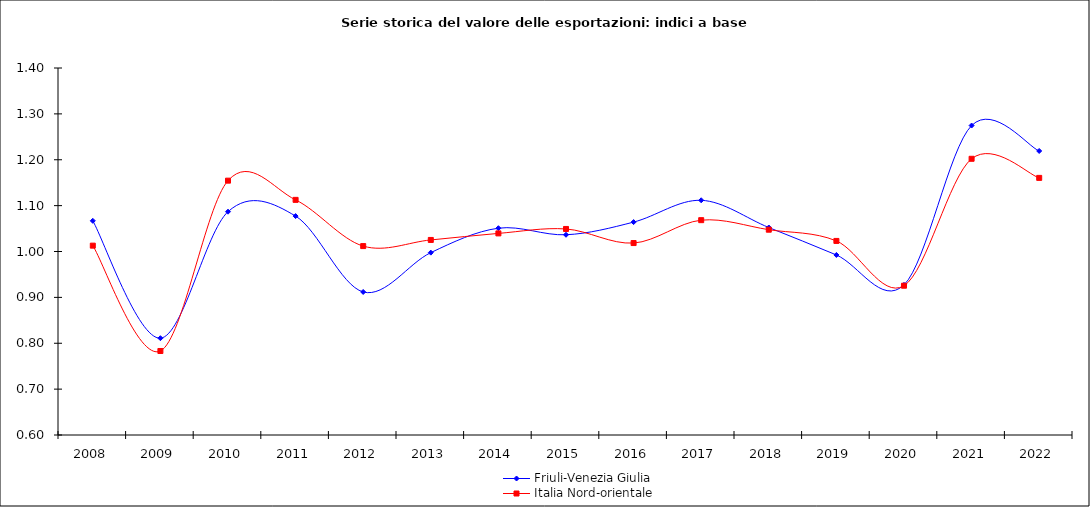
| Category | Friuli-Venezia Giulia  | Italia Nord-orientale |
|---|---|---|
| 2008.0 | 1.067 | 1.013 |
| 2009.0 | 0.811 | 0.783 |
| 2010.0 | 1.087 | 1.154 |
| 2011.0 | 1.077 | 1.113 |
| 2012.0 | 0.912 | 1.012 |
| 2013.0 | 0.998 | 1.025 |
| 2014.0 | 1.051 | 1.039 |
| 2015.0 | 1.036 | 1.049 |
| 2016.0 | 1.064 | 1.018 |
| 2017.0 | 1.112 | 1.068 |
| 2018.0 | 1.052 | 1.048 |
| 2019.0 | 0.992 | 1.023 |
| 2020.0 | 0.927 | 0.925 |
| 2021.0 | 1.275 | 1.202 |
| 2022.0 | 1.219 | 1.16 |